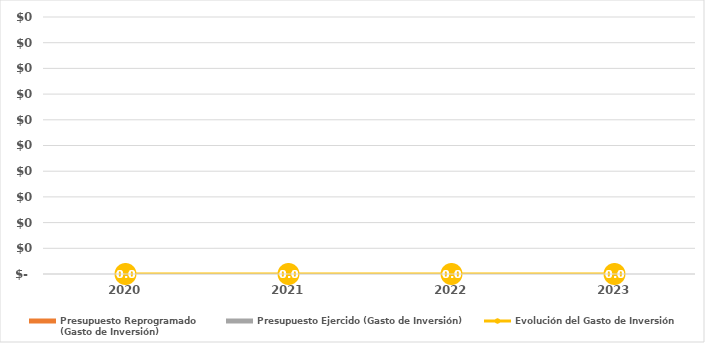
| Category | Presupuesto Reprogramado
(Gasto de Inversión) | Presupuesto Ejercido (Gasto de Inversión) |
|---|---|---|
| 2020.0 | 0 | 0 |
| 2021.0 | 0 | 0 |
| 2022.0 | 0 | 0 |
| 2023.0 | 0 | 0 |